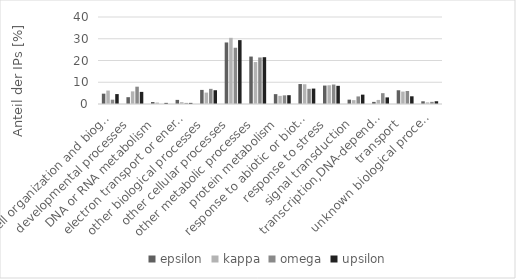
| Category | epsilon | kappa | omega | upsilon |
|---|---|---|---|---|
| cell organization and biogenesis  | 4.752 | 6.18 | 1.99 | 4.557 |
| developmental processes  | 3.132 | 5.805 | 7.96 | 5.57 |
| DNA or RNA metabolism  | 0.918 | 0.655 | 0 | 0.506 |
| electron transport or energy pathways  | 1.89 | 0.843 | 0.498 | 0.506 |
| other biological processes  | 6.479 | 5.243 | 6.965 | 6.329 |
| other cellular processes  | 28.294 | 30.431 | 25.871 | 29.367 |
| other metabolic processes  | 21.814 | 19.288 | 21.393 | 21.519 |
| protein metabolism  | 4.536 | 3.745 | 3.98 | 4.051 |
| response to abiotic or biotic stimulus  | 9.179 | 9.082 | 6.965 | 7.089 |
| response to stress  | 8.477 | 8.614 | 8.955 | 8.354 |
| signal transduction  | 1.998 | 1.779 | 3.483 | 4.304 |
| transcription,DNA-dependent  | 0.972 | 1.873 | 4.975 | 3.038 |
| transport  | 6.317 | 5.712 | 5.97 | 3.544 |
| unknown biological processes  | 1.242 | 0.749 | 0.995 | 1.266 |